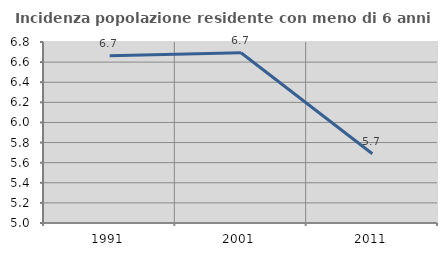
| Category | Incidenza popolazione residente con meno di 6 anni |
|---|---|
| 1991.0 | 6.663 |
| 2001.0 | 6.694 |
| 2011.0 | 5.689 |